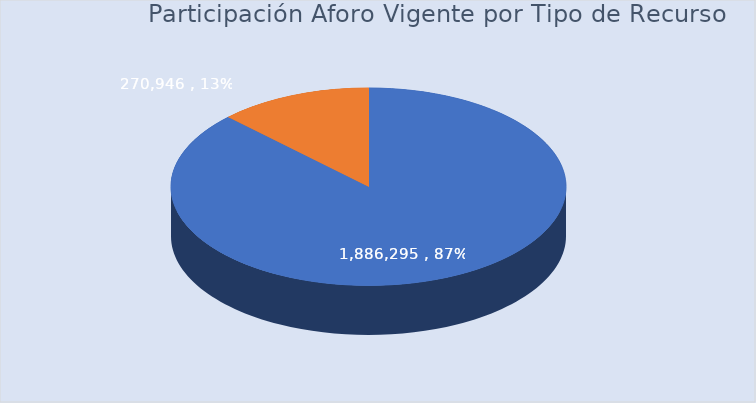
| Category | Total |
|---|---|
| Nación | 1886294.901 |
| Propios | 270945.743 |